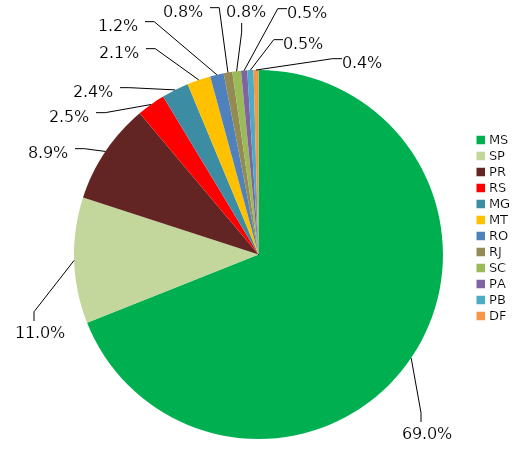
| Category | Series 0 |
|---|---|
| MS | 0.676 |
| SP | 0.108 |
| PR | 0.087 |
| RS | 0.024 |
| MG | 0.023 |
| MT | 0.02 |
| RO | 0.012 |
| RJ | 0.007 |
| SC | 0.007 |
| PA | 0.005 |
| PB | 0.005 |
| DF | 0.004 |